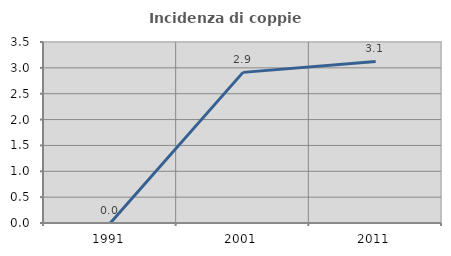
| Category | Incidenza di coppie miste |
|---|---|
| 1991.0 | 0 |
| 2001.0 | 2.913 |
| 2011.0 | 3.125 |